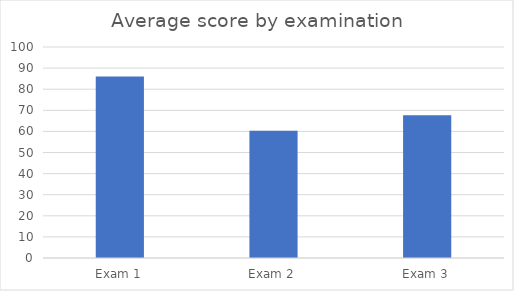
| Category | Series 0 |
|---|---|
| Exam 1 | 86.06 |
| Exam 2 | 60.3 |
| Exam 3 | 67.7 |